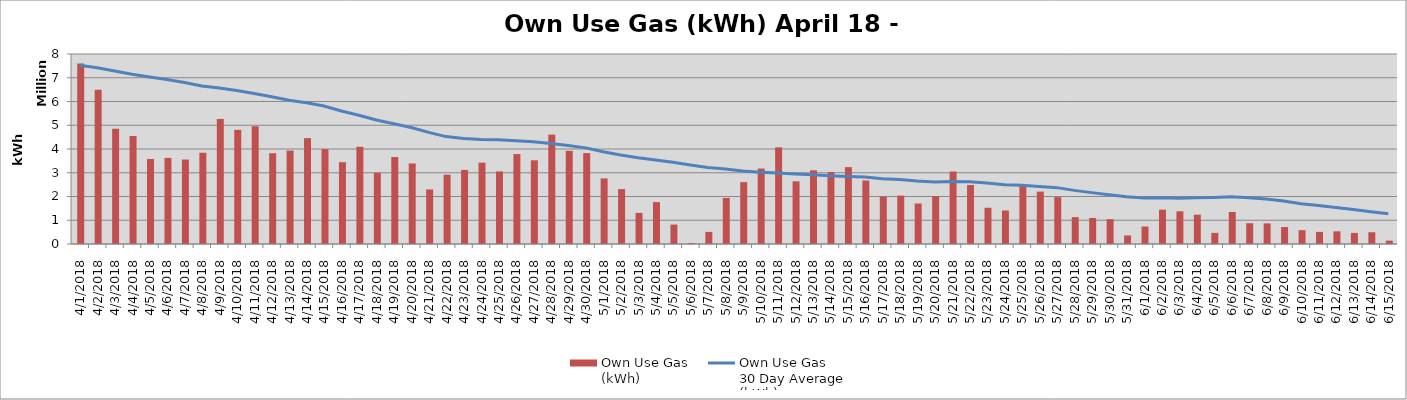
| Category | Own Use Gas
(kWh) |
|---|---|
| 4/1/18 | 7604219 |
| 4/2/18 | 6491744 |
| 4/3/18 | 4853061 |
| 4/4/18 | 4548355 |
| 4/5/18 | 3579529 |
| 4/6/18 | 3626281 |
| 4/7/18 | 3556372 |
| 4/8/18 | 3841883 |
| 4/9/18 | 5265679 |
| 4/10/18 | 4807054 |
| 4/11/18 | 4959534 |
| 4/12/18 | 3821856 |
| 4/13/18 | 3934795 |
| 4/14/18 | 4456419 |
| 4/15/18 | 3995686 |
| 4/16/18 | 3444380 |
| 4/17/18 | 4092522 |
| 4/18/18 | 2999712 |
| 4/19/18 | 3664195 |
| 4/20/18 | 3390440 |
| 4/21/18 | 2295820 |
| 4/22/18 | 2918571 |
| 4/23/18 | 3119473 |
| 4/24/18 | 3425965 |
| 4/25/18 | 3055632 |
| 4/26/18 | 3787600 |
| 4/27/18 | 3525448 |
| 4/28/18 | 4605379 |
| 4/29/18 | 3923695 |
| 4/30/18 | 3827817 |
| 5/1/18 | 2762231 |
| 5/2/18 | 2312007 |
| 5/3/18 | 1310460 |
| 5/4/18 | 1764184 |
| 5/5/18 | 818415 |
| 5/6/18 | 40935 |
| 5/7/18 | 510015 |
| 5/8/18 | 1940158 |
| 5/9/18 | 2606521 |
| 5/10/18 | 3176745 |
| 5/11/18 | 4069107 |
| 5/12/18 | 2640340 |
| 5/13/18 | 3103173 |
| 5/14/18 | 3029336 |
| 5/15/18 | 3236328 |
| 5/16/18 | 2675160 |
| 5/17/18 | 1992898 |
| 5/18/18 | 2037327 |
| 5/19/18 | 1704610 |
| 5/20/18 | 2014479 |
| 5/21/18 | 3053999 |
| 5/22/18 | 2483233 |
| 5/23/18 | 1526994 |
| 5/24/18 | 1411165 |
| 5/25/18 | 2440674 |
| 5/26/18 | 2206250 |
| 5/27/18 | 1974225 |
| 5/28/18 | 1132292 |
| 5/29/18 | 1096446 |
| 5/30/18 | 1046477 |
| 5/31/18 | 361289 |
| 6/1/18 | 736094 |
| 6/2/18 | 1445361 |
| 6/3/18 | 1376812 |
| 6/4/18 | 1236150 |
| 6/5/18 | 468116 |
| 6/6/18 | 1349756 |
| 6/7/18 | 874505 |
| 6/8/18 | 867596 |
| 6/9/18 | 713408 |
| 6/10/18 | 581199 |
| 6/11/18 | 509489 |
| 6/12/18 | 533323 |
| 6/13/18 | 466326 |
| 6/14/18 | 495564 |
| 6/15/18 | 141900 |